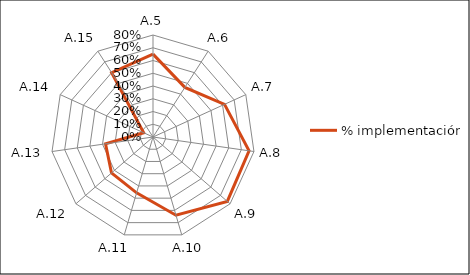
| Category | % implementación | Máx |
|---|---|---|
| A.5 | 0.65 |  |
| A.6 | 0.463 |  |
| A.7 | 0.617 |  |
| A.8 | 0.761 |  |
| A.9 | 0.771 |  |
| A.10 | 0.639 |  |
| A.11 | 0.457 |  |
| A.12 | 0.431 |  |
| A.13 | 0.376 |  |
| A.14 | 0.08 |  |
| A.15 | 0.6 |  |